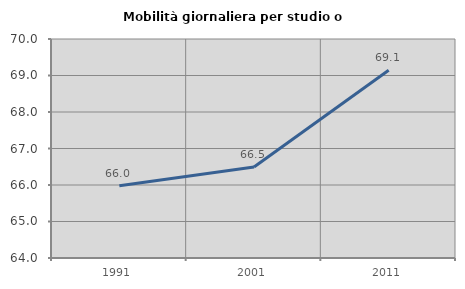
| Category | Mobilità giornaliera per studio o lavoro |
|---|---|
| 1991.0 | 65.98 |
| 2001.0 | 66.491 |
| 2011.0 | 69.144 |